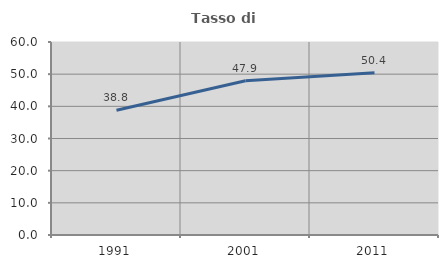
| Category | Tasso di occupazione   |
|---|---|
| 1991.0 | 38.805 |
| 2001.0 | 47.95 |
| 2011.0 | 50.422 |